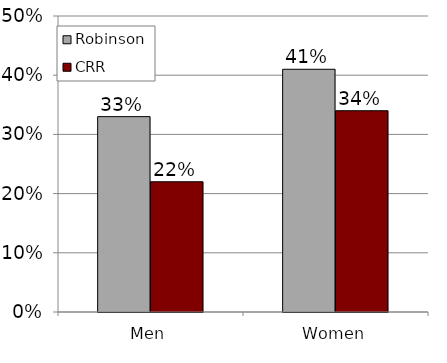
| Category | Robinson | CRR |
|---|---|---|
| Men | 0.33 | 0.22 |
| Women | 0.41 | 0.34 |